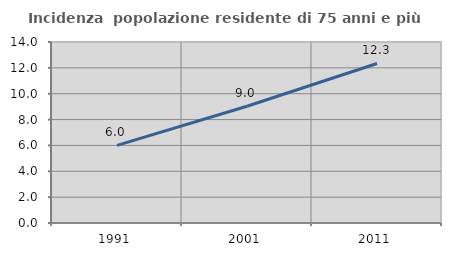
| Category | Incidenza  popolazione residente di 75 anni e più |
|---|---|
| 1991.0 | 6.002 |
| 2001.0 | 9.032 |
| 2011.0 | 12.339 |